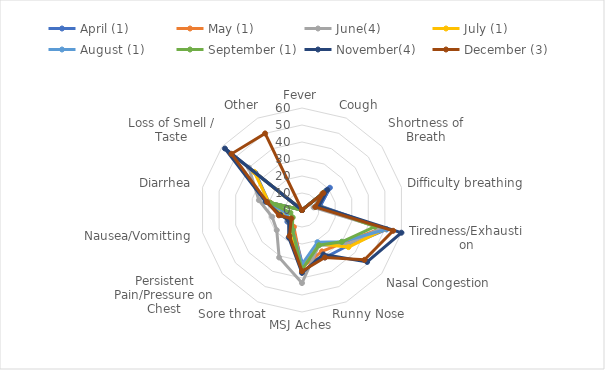
| Category | April (1) | May (1) | June(4) | July (1) | August (1) | September (1) | November(4) | December (3) |
|---|---|---|---|---|---|---|---|---|
| Fever | 0 | 0 | 0 | 0 | 0 | 0 | 0 | 0 |
| Cough | 0 | 0 | 0 | 0 | 0 | 0 | 0 | 0 |
| Shortness of Breath | 21 | 15 | 16 | 17 | 18 | 16 | 19 | 16 |
| Difficulty breathing | 11 | 8 | 7 | 10 | 9 | 10 | 10 | 8 |
| Tiredness/Exhaustion | 51 | 48 | 48 | 50 | 51 | 44 | 60 | 55 |
| Nasal Congestion | 34 | 31 | 33 | 35 | 30 | 30 | 49 | 47 |
| Runny Nose | 31 | 27 | 23 | 22 | 21 | 23 | 29 | 31 |
| MSJ Aches | 31 | 34 | 43 | 33 | 32 | 35 | 37 | 36 |
| Sore throat | 12 | 11 | 31 | 16 | 13 | 13 | 18 | 17 |
| Persistent Pain/Pressure on Chest | 11 | 10 | 19 | 10 | 10 | 7 | 10 | 8 |
| Nausea/Vomitting | 9 | 9 | 18 | 11 | 9 | 7 | 13 | 14 |
| Diarrhea | 20 | 19 | 26 | 20 | 21 | 19 | 22 | 21 |
| Loss of Smell / Taste | 35 | 0 | 40 | 36 | 0 | 0 | 58 | 53 |
| Other | 0 | 0 | 0 | 0 | 0 | 0 | 0 | 50 |